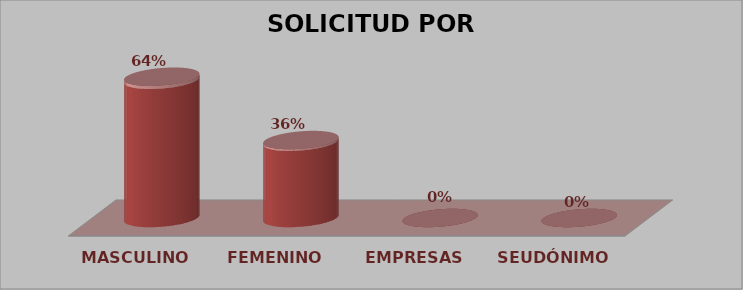
| Category | SOLICITUD POR GÉNERO | Series 1 |
|---|---|---|
| MASCULINO | 29 | 0.644 |
| FEMENINO | 16 | 0.356 |
| EMPRESAS | 0 | 0 |
| SEUDÓNIMO | 0 | 0 |